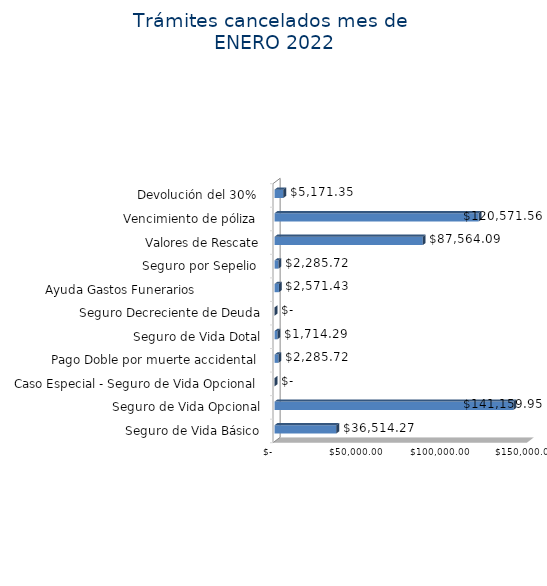
| Category | Monto  |
|---|---|
| Seguro de Vida Básico | 36514.27 |
| Seguro de Vida Opcional | 141159.95 |
| Caso Especial - Seguro de Vida Opcional  | 0 |
| Pago Doble por muerte accidental  | 2285.72 |
| Seguro de Vida Dotal | 1714.29 |
| Seguro Decreciente de Deuda | 0 |
| Ayuda Gastos Funerarios                  | 2571.43 |
| Seguro por Sepelio  | 2285.72 |
| Valores de Rescate | 87564.09 |
| Vencimiento de póliza  | 120571.56 |
| Devolución del 30%  | 5171.35 |